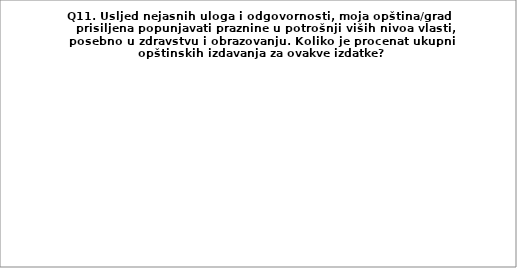
| Category | Series 0 |
|---|---|
| Do 2% izdavanja | 28.302 |
| Do 4% izdavanja | 24.528 |
| Do 6% izdavanja | 20.755 |
| Do 8% izdavanja | 1.887 |
| Najmanje 10% izdavanja | 9.434 |
| Moja opština/grad nema ovakvih izdavanja | 15.094 |